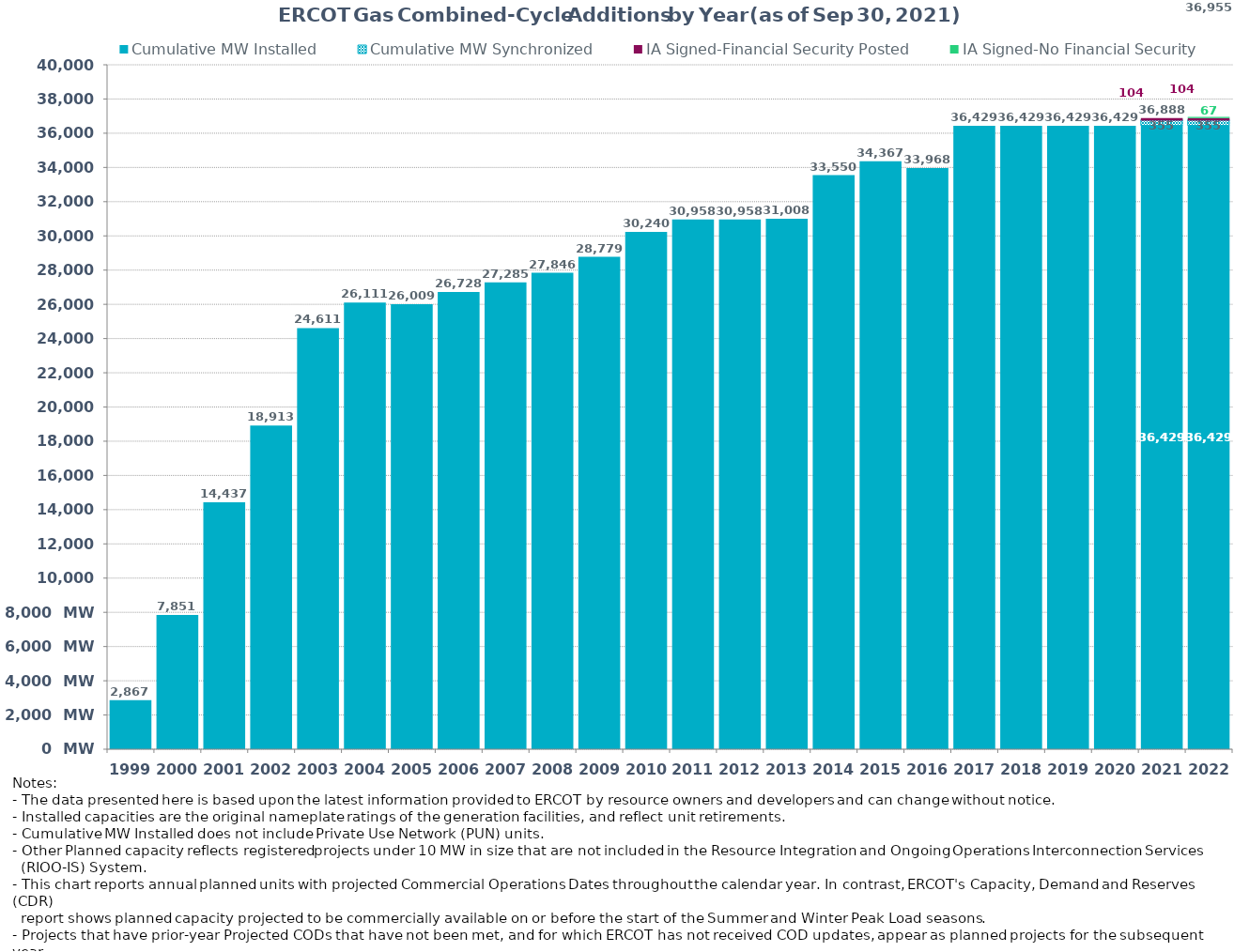
| Category | Cumulative MW Installed | Cumulative MW Synchronized | IA Signed-Financial Security Posted  | IA Signed-No Financial Security  | Other Planned | Cumulative Installed and Planned |
|---|---|---|---|---|---|---|
| 1999.0 | 2867 | 0 | 0 | 0 | 0 | 2867 |
| 2000.0 | 7851 | 0 | 0 | 0 | 0 | 7851 |
| 2001.0 | 14437 | 0 | 0 | 0 | 0 | 14437 |
| 2002.0 | 18913 | 0 | 0 | 0 | 0 | 18913 |
| 2003.0 | 24611 | 0 | 0 | 0 | 0 | 24611 |
| 2004.0 | 26111 | 0 | 0 | 0 | 0 | 26111 |
| 2005.0 | 26009 | 0 | 0 | 0 | 0 | 26009 |
| 2006.0 | 26728 | 0 | 0 | 0 | 0 | 26728 |
| 2007.0 | 27285 | 0 | 0 | 0 | 0 | 27285 |
| 2008.0 | 27846 | 0 | 0 | 0 | 0 | 27846 |
| 2009.0 | 28779 | 0 | 0 | 0 | 0 | 28779 |
| 2010.0 | 30240 | 0 | 0 | 0 | 0 | 30240 |
| 2011.0 | 30958 | 0 | 0 | 0 | 0 | 30958 |
| 2012.0 | 30958 | 0 | 0 | 0 | 0 | 30958 |
| 2013.0 | 31008 | 0 | 0 | 0 | 0 | 31008 |
| 2014.0 | 33550 | 0 | 0 | 0 | 0 | 33550 |
| 2015.0 | 34367 | 0 | 0 | 0 | 0 | 34367 |
| 2016.0 | 33968 | 0 | 0 | 0 | 0 | 33968 |
| 2017.0 | 36429 | 0 | 0 | 0 | 0 | 36429 |
| 2018.0 | 36429 | 0 | 0 | 0 | 0 | 36429 |
| 2019.0 | 36429 | 0 | 0 | 0 | 0 | 36429 |
| 2020.0 | 36429 | 0 | 0 | 0 | 0 | 36429 |
| 2021.0 | 36429 | 355 | 104 | 0 | 0 | 36888 |
| 2022.0 | 36429 | 355 | 104 | 67 | 0 | 36955 |